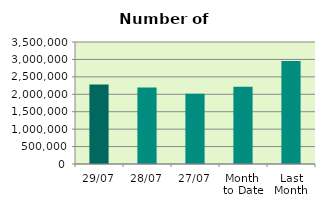
| Category | Series 0 |
|---|---|
| 29/07 | 2277584 |
| 28/07 | 2194570 |
| 27/07 | 2012448 |
| Month 
to Date | 2216838 |
| Last
Month | 2956123.091 |